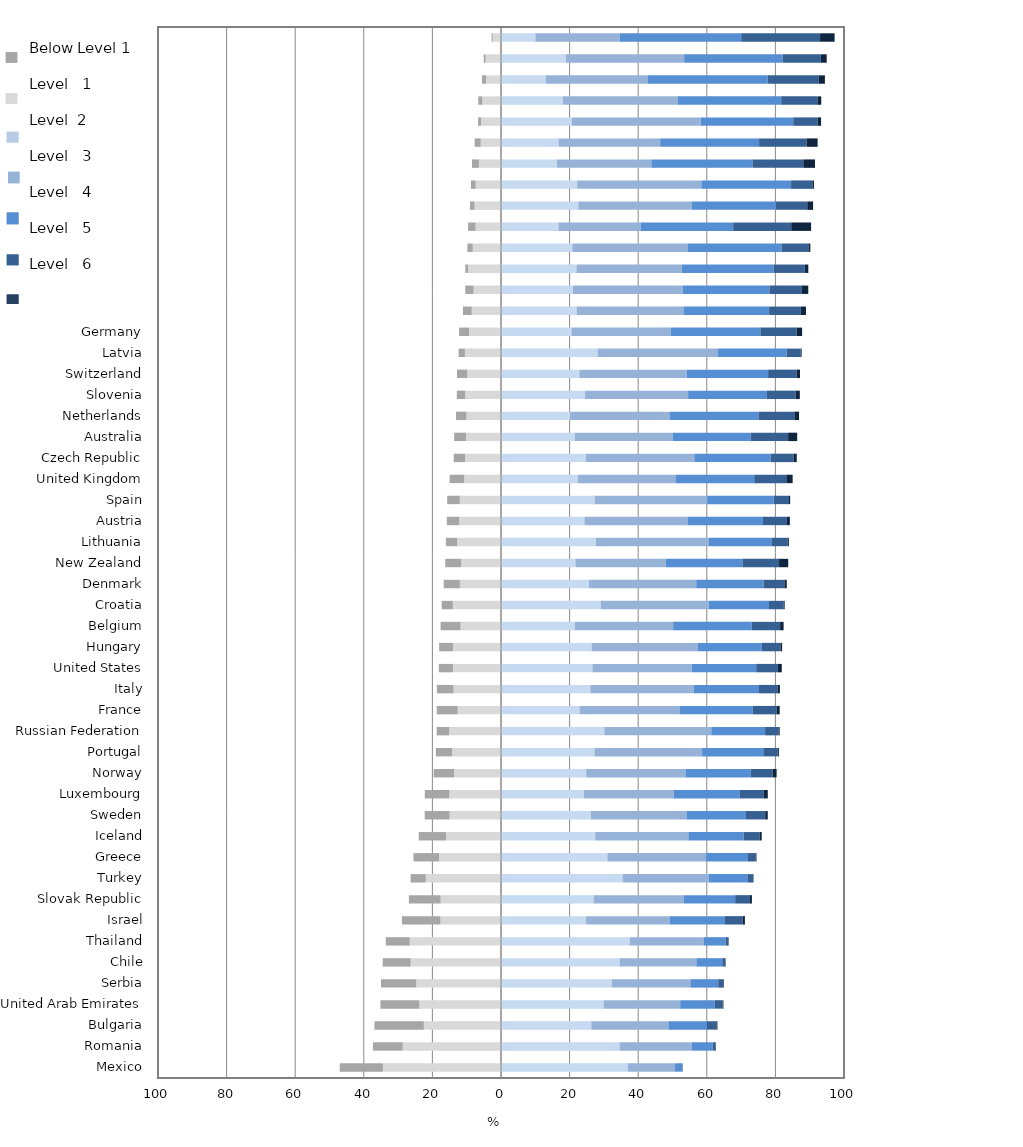
| Category | Level 1 | Below Level 1 | Level 2 | Level 3 | Level 4
 | Level 5 | Level 6
 |
|---|---|---|---|---|---|---|---|
| Shanghai-China | -2.416 | -0.319 | 10.021 | 24.564 | 35.454 | 22.985 | 4.24 |
| Estonia | -4.495 | -0.542 | 18.951 | 34.452 | 28.746 | 11.105 | 1.708 |
| Hong Kong-China | -4.376 | -1.186 | 13.027 | 29.831 | 34.899 | 14.871 | 1.81 |
| Korea | -5.453 | -1.177 | 18.041 | 33.565 | 30.08 | 10.569 | 1.116 |
| Vietnam | -5.827 | -0.859 | 20.685 | 37.53 | 26.983 | 7.136 | 0.979 |
| Finland | -5.913 | -1.78 | 16.793 | 29.608 | 28.846 | 13.852 | 3.209 |
| Japan | -6.437 | -2.019 | 16.32 | 27.534 | 29.454 | 14.829 | 3.407 |
| Macao-China | -7.394 | -1.356 | 22.23 | 36.188 | 26.157 | 6.237 | 0.439 |
| Poland | -7.709 | -1.302 | 22.544 | 33.147 | 24.47 | 9.126 | 1.703 |
| Singapore | -7.404 | -2.188 | 16.741 | 23.96 | 26.994 | 16.919 | 5.794 |
| Chinese Taipei | -8.234 | -1.58 | 20.79 | 33.728 | 27.329 | 7.781 | 0.559 |
| Liechtenstein | -9.623 | -0.778 | 21.989 | 30.762 | 26.715 | 9.104 | 1.029 |
| Canada | -8 | -2.416 | 20.964 | 31.974 | 25.335 | 9.467 | 1.845 |
| Ireland | -8.528 | -2.562 | 22.044 | 31.145 | 24.981 | 9.262 | 1.477 |
| Germany | -9.312 | -2.902 | 20.531 | 28.922 | 26.168 | 10.574 | 1.591 |
| Latvia | -10.525 | -1.835 | 28.175 | 35.121 | 19.969 | 4.047 | 0.328 |
| Switzerland | -9.829 | -2.993 | 22.84 | 31.318 | 23.715 | 8.306 | 1 |
| Slovenia | -10.434 | -2.447 | 24.512 | 30.048 | 22.975 | 8.374 | 1.211 |
| Netherlands | -10.055 | -3.07 | 20.135 | 29.133 | 25.802 | 10.468 | 1.337 |
| Australia | -10.215 | -3.431 | 21.493 | 28.53 | 22.775 | 10.912 | 2.644 |
| Czech Republic | -10.458 | -3.323 | 24.698 | 31.671 | 22.226 | 6.728 | 0.896 |
| United Kingdom | -10.716 | -4.253 | 22.438 | 28.424 | 22.978 | 9.348 | 1.842 |
| Spain | -12.014 | -3.684 | 27.296 | 32.796 | 19.402 | 4.465 | 0.342 |
| Austria | -12.169 | -3.615 | 24.337 | 30.113 | 21.912 | 7.011 | 0.842 |
| Lithuania | -12.727 | -3.35 | 27.616 | 32.86 | 18.344 | 4.749 | 0.355 |
| New Zealand | -11.595 | -4.667 | 21.713 | 26.367 | 22.305 | 10.688 | 2.664 |
| Denmark | -11.987 | -4.704 | 25.651 | 31.27 | 19.632 | 6.07 | 0.686 |
| Croatia | -14.044 | -3.25 | 29.085 | 31.441 | 17.603 | 4.263 | 0.314 |
| Belgium | -11.79 | -5.82 | 21.504 | 28.674 | 22.923 | 8.274 | 1.017 |
| Hungary | -13.973 | -4.071 | 26.415 | 30.899 | 18.716 | 5.45 | 0.475 |
| United States | -13.986 | -4.151 | 26.653 | 28.929 | 18.818 | 6.324 | 1.139 |
| Italy | -13.817 | -4.879 | 26.042 | 30.12 | 19.064 | 5.5 | 0.578 |
| France | -12.633 | -6.107 | 22.88 | 29.167 | 21.313 | 6.945 | 0.955 |
| Russian Federation | -15.106 | -3.648 | 30.131 | 31.185 | 15.678 | 3.917 | 0.335 |
| Portugal | -14.265 | -4.724 | 27.275 | 31.359 | 17.84 | 4.226 | 0.31 |
| Norway | -13.643 | -6.001 | 24.834 | 28.947 | 19.029 | 6.418 | 1.128 |
| Luxembourg | -15.06 | -7.159 | 24.202 | 26.215 | 19.184 | 7.012 | 1.168 |
| Sweden | -14.979 | -7.252 | 26.219 | 28.008 | 17.197 | 5.607 | 0.737 |
| Iceland | -16.017 | -7.974 | 27.466 | 27.155 | 16.174 | 4.565 | 0.65 |
| Greece | -18.081 | -7.435 | 31.02 | 28.797 | 12.183 | 2.289 | 0.194 |
| Turkey | -21.924 | -4.431 | 35.444 | 25.058 | 11.343 | 1.763 | 0.038 |
| Slovak Republic | -17.62 | -9.235 | 27.014 | 26.218 | 15.039 | 4.299 | 0.575 |
| Israel | -17.663 | -11.221 | 24.818 | 24.373 | 16.096 | 5.211 | 0.619 |
| Thailand | -26.611 | -6.989 | 37.512 | 21.574 | 6.394 | 0.863 | 0.057 |
| Chile | -26.346 | -8.142 | 34.584 | 22.374 | 7.55 | 0.963 | 0.041 |
| Serbia | -24.681 | -10.305 | 32.369 | 22.844 | 8.109 | 1.599 | 0.094 |
| United Arab Emirates | -23.818 | -11.338 | 29.901 | 22.341 | 10.07 | 2.274 | 0.257 |
| Bulgaria | -22.498 | -14.402 | 26.318 | 22.497 | 11.201 | 2.81 | 0.276 |
| Romania | -28.653 | -8.681 | 34.563 | 21.007 | 6.18 | 0.869 | 0.048 |
| Mexico | -34.424 | -12.593 | 36.964 | 13.774 | 2.107 | 0.138 | 0 |